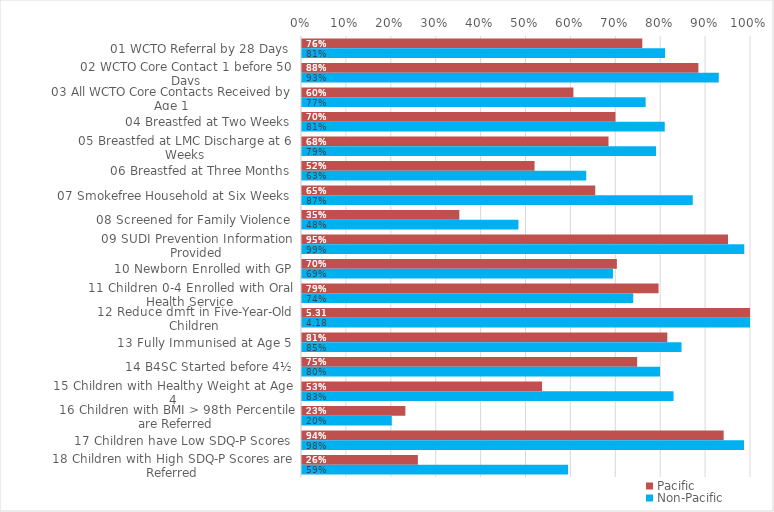
| Category | Pacific | Non-Pacific |
|---|---|---|
| 01 WCTO Referral by 28 Days | 0.758 | 0.809 |
| 02 WCTO Core Contact 1 before 50 Days | 0.883 | 0.928 |
| 03 All WCTO Core Contacts Received by Age 1 | 0.604 | 0.765 |
| 04 Breastfed at Two Weeks | 0.698 | 0.808 |
| 05 Breastfed at LMC Discharge at 6 Weeks | 0.683 | 0.789 |
| 06 Breastfed at Three Months | 0.518 | 0.633 |
| 07 Smokefree Household at Six Weeks | 0.653 | 0.87 |
| 08 Screened for Family Violence | 0.35 | 0.482 |
| 09 SUDI Prevention Information Provided | 0.949 | 0.985 |
| 10 Newborn Enrolled with GP | 0.701 | 0.692 |
| 11 Children 0-4 Enrolled with Oral Health Service | 0.794 | 0.738 |
| 12 Reduce dmft in Five-Year-Old Children | 5.311 | 4.185 |
| 13 Fully Immunised at Age 5 | 0.814 | 0.845 |
| 14 B4SC Started before 4½ | 0.746 | 0.797 |
| 15 Children with Healthy Weight at Age 4 | 0.535 | 0.827 |
| 16 Children with BMI > 98th Percentile are Referred | 0.23 | 0.2 |
| 17 Children have Low SDQ-P Scores | 0.939 | 0.984 |
| 18 Children with High SDQ-P Scores are Referred | 0.258 | 0.593 |